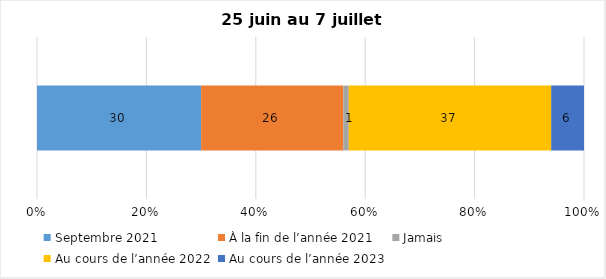
| Category | Septembre 2021 | À la fin de l’année 2021 | Jamais | Au cours de l’année 2022 | Au cours de l’année 2023 |
|---|---|---|---|---|---|
| 0 | 30 | 26 | 1 | 37 | 6 |